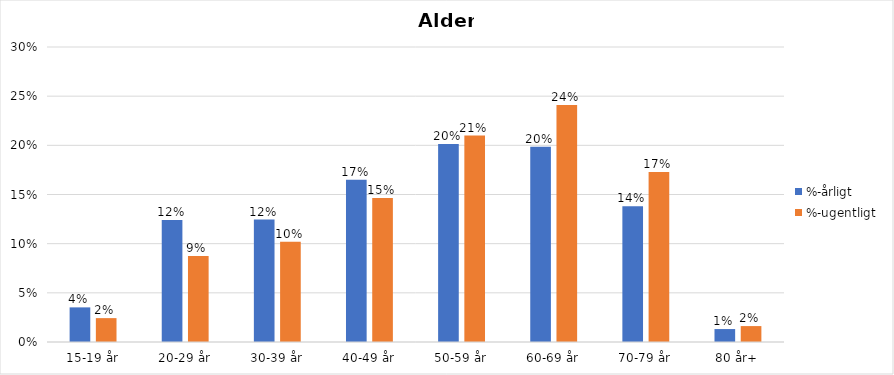
| Category | %-årligt | %-ugentligt |
|---|---|---|
| 15-19 år | 0.035 | 0.024 |
| 20-29 år | 0.124 | 0.087 |
| 30-39 år | 0.125 | 0.102 |
| 40-49 år | 0.165 | 0.146 |
| 50-59 år | 0.201 | 0.21 |
| 60-69 år | 0.199 | 0.241 |
| 70-79 år | 0.138 | 0.173 |
| 80 år+ | 0.013 | 0.016 |